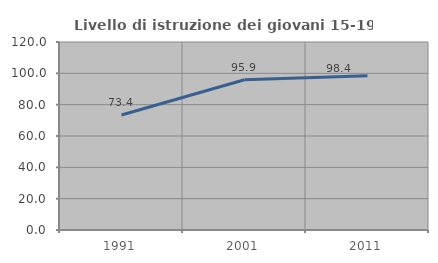
| Category | Livello di istruzione dei giovani 15-19 anni |
|---|---|
| 1991.0 | 73.377 |
| 2001.0 | 95.918 |
| 2011.0 | 98.387 |